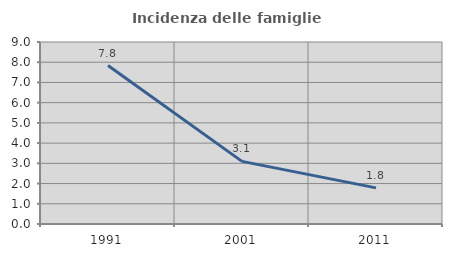
| Category | Incidenza delle famiglie numerose |
|---|---|
| 1991.0 | 7.837 |
| 2001.0 | 3.097 |
| 2011.0 | 1.786 |